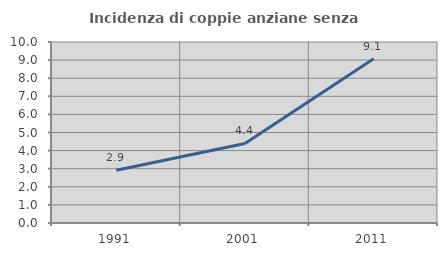
| Category | Incidenza di coppie anziane senza figli  |
|---|---|
| 1991.0 | 2.914 |
| 2001.0 | 4.397 |
| 2011.0 | 9.071 |